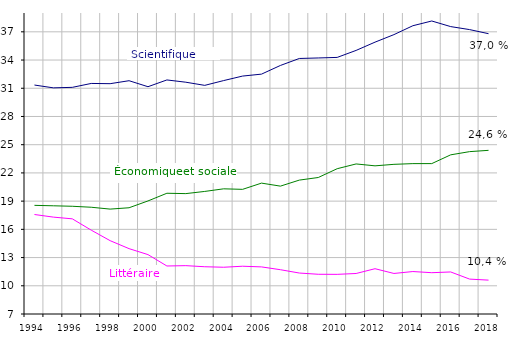
| Category | TERMINALE S | TERMINALE L | TERMINALE ES |
|---|---|---|---|
| 1994.0 | 31.342 | 17.577 | 18.551 |
| 1995.0 | 31.042 | 17.3 | 18.505 |
| 1996.0 | 31.095 | 17.117 | 18.452 |
| 1997.0 | 31.51 | 15.914 | 18.35 |
| 1998.0 | 31.486 | 14.796 | 18.152 |
| 1999.0 | 31.801 | 13.947 | 18.295 |
| 2000.0 | 31.163 | 13.315 | 19.019 |
| 2001.0 | 31.883 | 12.103 | 19.836 |
| 2002.0 | 31.642 | 12.141 | 19.798 |
| 2003.0 | 31.307 | 12.024 | 20.031 |
| 2004.0 | 31.816 | 11.971 | 20.308 |
| 2005.0 | 32.294 | 12.079 | 20.252 |
| 2006.0 | 32.501 | 12.008 | 20.915 |
| 2007.0 | 33.422 | 11.709 | 20.593 |
| 2008.0 | 34.165 | 11.355 | 21.235 |
| 2009.0 | 34.22 | 11.224 | 21.51 |
| 2010.0 | 34.279 | 11.215 | 22.445 |
| 2011.0 | 35.022 | 11.307 | 22.952 |
| 2012.0 | 35.901 | 11.814 | 22.752 |
| 2013.0 | 36.702 | 11.31 | 22.911 |
| 2014.0 | 37.647 | 11.513 | 22.987 |
| 2015.0 | 38.15 | 11.391 | 22.989 |
| 2016.0 | 37.554 | 11.469 | 23.921 |
| 2017.0 | 37.235 | 10.71 | 24.262 |
| 2018.0 | 36.8 | 10.6 | 24.4 |